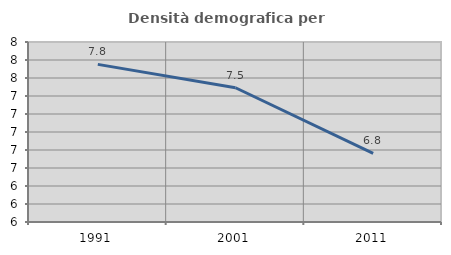
| Category | Densità demografica |
|---|---|
| 1991.0 | 7.752 |
| 2001.0 | 7.491 |
| 2011.0 | 6.763 |